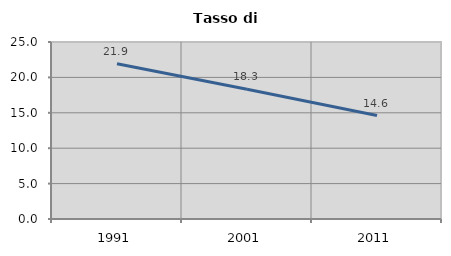
| Category | Tasso di disoccupazione   |
|---|---|
| 1991.0 | 21.924 |
| 2001.0 | 18.315 |
| 2011.0 | 14.612 |